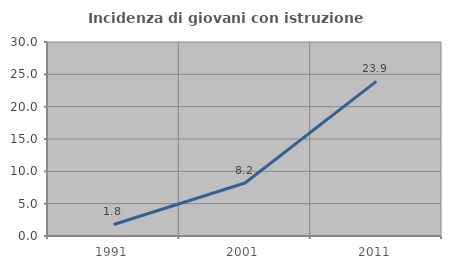
| Category | Incidenza di giovani con istruzione universitaria |
|---|---|
| 1991.0 | 1.786 |
| 2001.0 | 8.197 |
| 2011.0 | 23.913 |